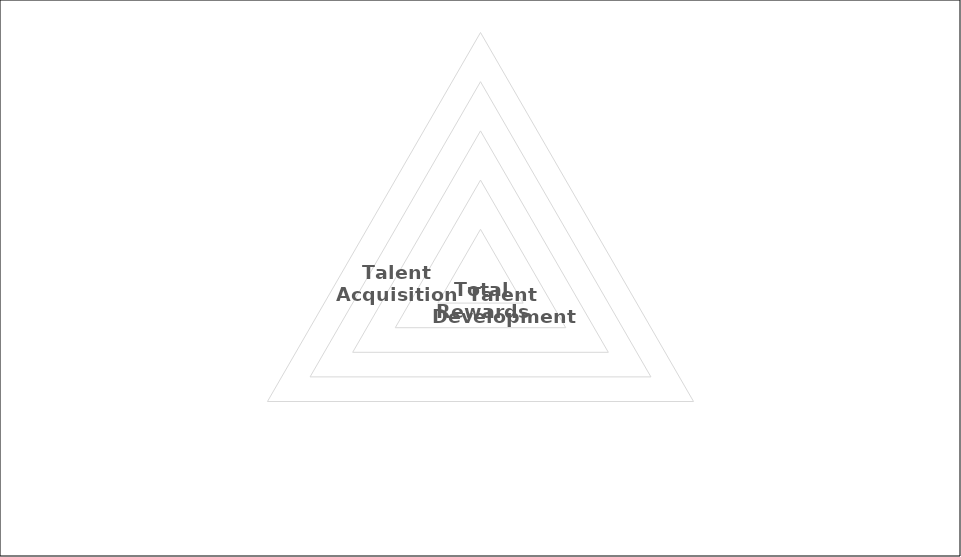
| Category | Domain Score |
|---|---|
| Talent Acquisition | 0 |
| Talent Development | 0 |
| Total Rewards | 0 |